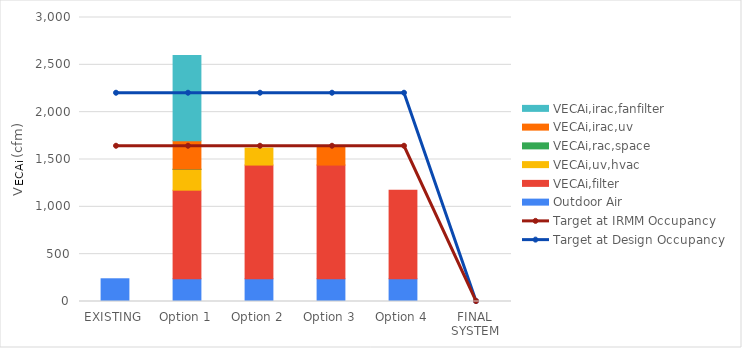
| Category | Outdoor Air | VECAi,filter | VECAi,uv,hvac | VECAi,rac,space | VECAi,irac,uv | VECAi,irac,fanfilter |
|---|---|---|---|---|---|---|
| EXISTING | 240 | 0 | 0 | 0 | 0 | 0 |
| Option 1 | 240 | 936 | 218.4 | 4 | 300 | 900 |
| Option 2 | 240 | 1201.2 | 179.4 | 0 | 0 | 0 |
| Option 3 | 240 | 1201.2 | 0 | 0 | 200 | 0 |
| Option 4 | 240 | 936 | 0 | 0 | 0 | 0 |
| FINAL SYSTEM | 0 | 0 | 0 | 0 | 0 | 0 |